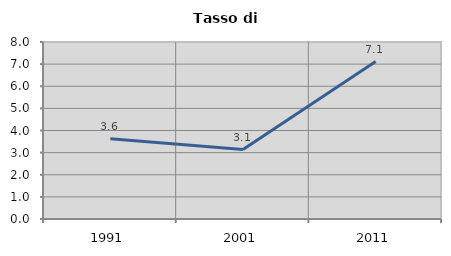
| Category | Tasso di disoccupazione   |
|---|---|
| 1991.0 | 3.624 |
| 2001.0 | 3.138 |
| 2011.0 | 7.118 |